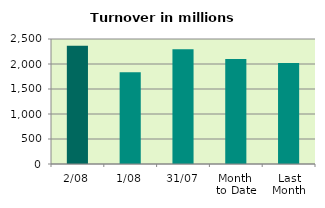
| Category | Series 0 |
|---|---|
| 2/08 | 2364.757 |
| 1/08 | 1833.628 |
| 31/07 | 2297.289 |
| Month 
to Date | 2099.192 |
| Last
Month | 2019.592 |